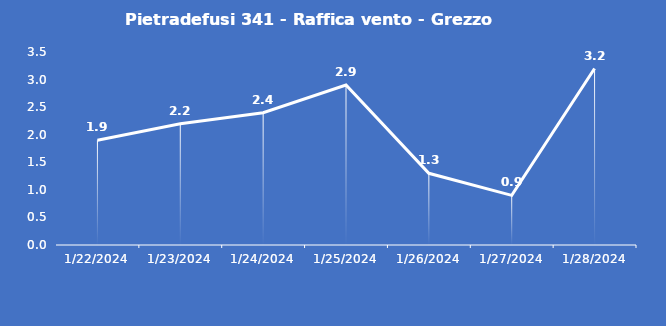
| Category | Pietradefusi 341 - Raffica vento - Grezzo (m/s) |
|---|---|
| 1/22/24 | 1.9 |
| 1/23/24 | 2.2 |
| 1/24/24 | 2.4 |
| 1/25/24 | 2.9 |
| 1/26/24 | 1.3 |
| 1/27/24 | 0.9 |
| 1/28/24 | 3.2 |